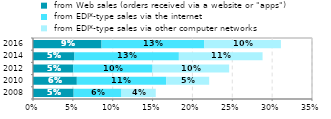
| Category |  from Web sales (orders received via a website or "apps") |  from EDI*-type sales via the internet |  from EDI*-type sales via other computer networks |
|---|---|---|---|
| 2008.0 | 0.051 | 0.06 | 0.043 |
| 2010.0 | 0.055 | 0.112 | 0.054 |
| 2012.0 | 0.05 | 0.099 | 0.096 |
| 2014.0 | 0.052 | 0.131 | 0.105 |
| 2016.0 | 0.086 | 0.129 | 0.096 |